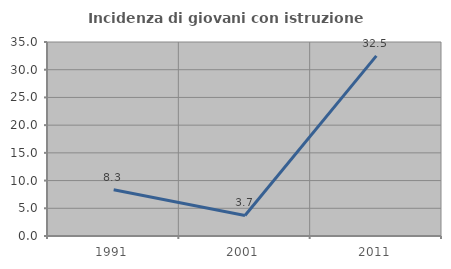
| Category | Incidenza di giovani con istruzione universitaria |
|---|---|
| 1991.0 | 8.333 |
| 2001.0 | 3.704 |
| 2011.0 | 32.5 |